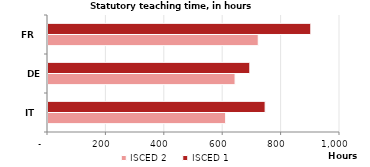
| Category | ISCED 2 | ISCED 1 |
|---|---|---|
| IT | 608.4 | 743.6 |
| DE | 640.659 | 691.162 |
| FR | 720 | 900 |